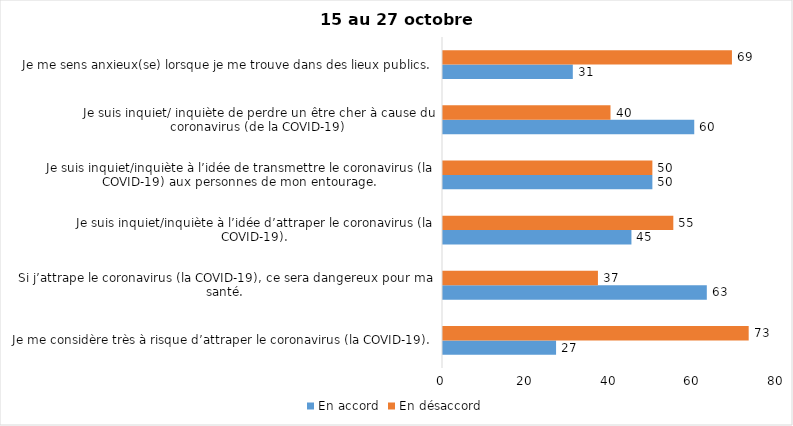
| Category | En accord | En désaccord |
|---|---|---|
| Je me considère très à risque d’attraper le coronavirus (la COVID-19). | 27 | 73 |
| Si j’attrape le coronavirus (la COVID-19), ce sera dangereux pour ma santé. | 63 | 37 |
| Je suis inquiet/inquiète à l’idée d’attraper le coronavirus (la COVID-19). | 45 | 55 |
| Je suis inquiet/inquiète à l’idée de transmettre le coronavirus (la COVID-19) aux personnes de mon entourage. | 50 | 50 |
| Je suis inquiet/ inquiète de perdre un être cher à cause du coronavirus (de la COVID-19) | 60 | 40 |
| Je me sens anxieux(se) lorsque je me trouve dans des lieux publics. | 31 | 69 |